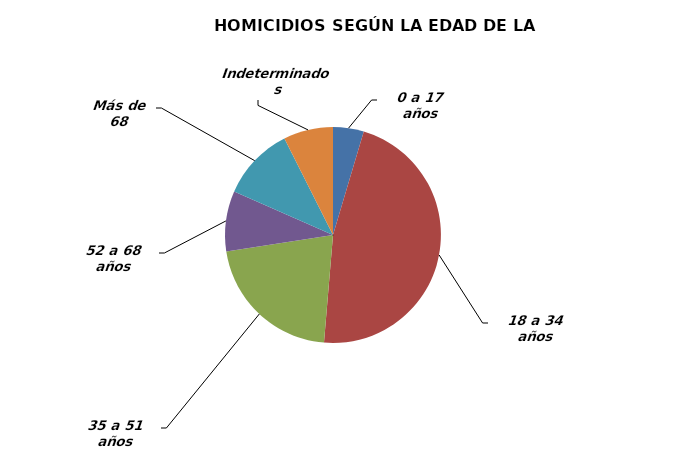
| Category | 0 a 17 años |
|---|---|
| 0 a 17 años | 57 |
| 18 a 34 años | 579 |
| 35 a 51 años | 263 |
| 52 a 68 años | 112 |
| Más de 68 | 136 |
| Indeterminados | 92 |